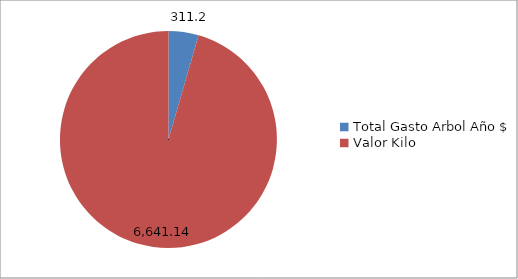
| Category | Series 0 |
|---|---|
| Total Gasto Arbol Año $ | 311.2 |
| Valor Kilo | 6641.136 |